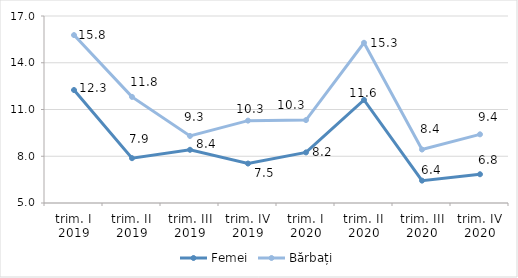
| Category | Femei | Bărbați |
|---|---|---|
| trim. I
2019 | 12.25 | 15.775 |
| trim. II
2019 | 7.876 | 11.811 |
| trim. III
2019 | 8.414 | 9.302 |
| trim. IV
2019 | 7.532 | 10.285 |
| trim. I
2020 | 8.246 | 10.32 |
| trim. II
2020 | 11.617 | 15.282 |
| trim. III
2020 | 6.436 | 8.432 |
| trim. IV
2020 | 6.845 | 9.407 |